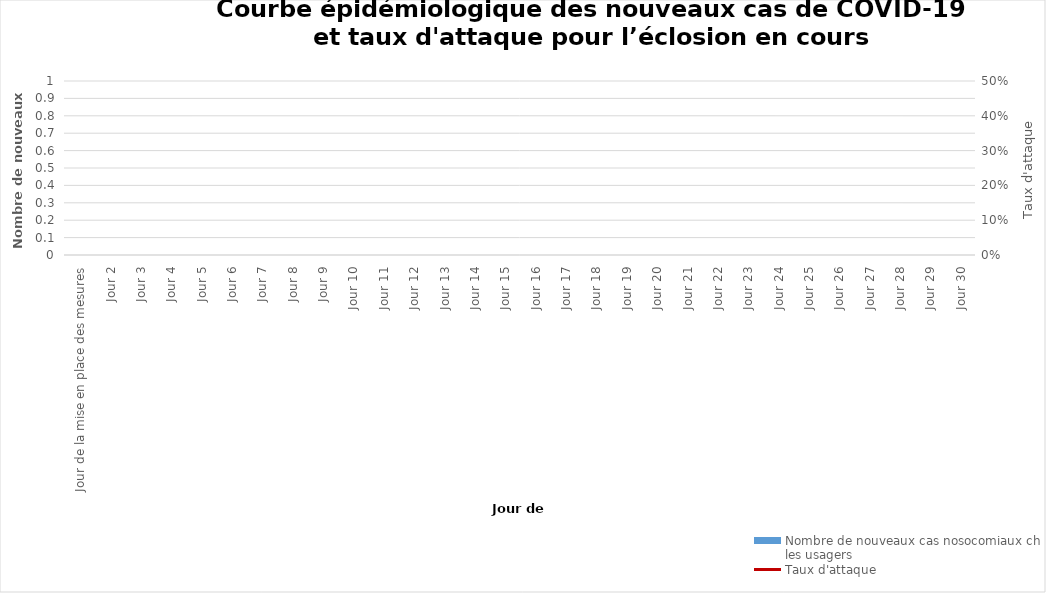
| Category | Nombre de nouveaux cas nosocomiaux chez les usagers |
|---|---|
| Jour de la mise en place des mesures | 0 |
| Jour 2 | 0 |
| Jour 3 | 0 |
| Jour 4 | 0 |
| Jour 5 | 0 |
| Jour 6 | 0 |
| Jour 7 | 0 |
| Jour 8 | 0 |
| Jour 9 | 0 |
| Jour 10 | 0 |
| Jour 11 | 0 |
| Jour 12 | 0 |
| Jour 13 | 0 |
| Jour 14 | 0 |
| Jour 15 | 0 |
| Jour 16 | 0 |
| Jour 17 | 0 |
| Jour 18 | 0 |
| Jour 19 | 0 |
| Jour 20 | 0 |
| Jour 21 | 0 |
| Jour 22 | 0 |
| Jour 23 | 0 |
| Jour 24 | 0 |
| Jour 25 | 0 |
| Jour 26 | 0 |
| Jour 27 | 0 |
| Jour 28 | 0 |
| Jour 29 | 0 |
| Jour 30 | 0 |